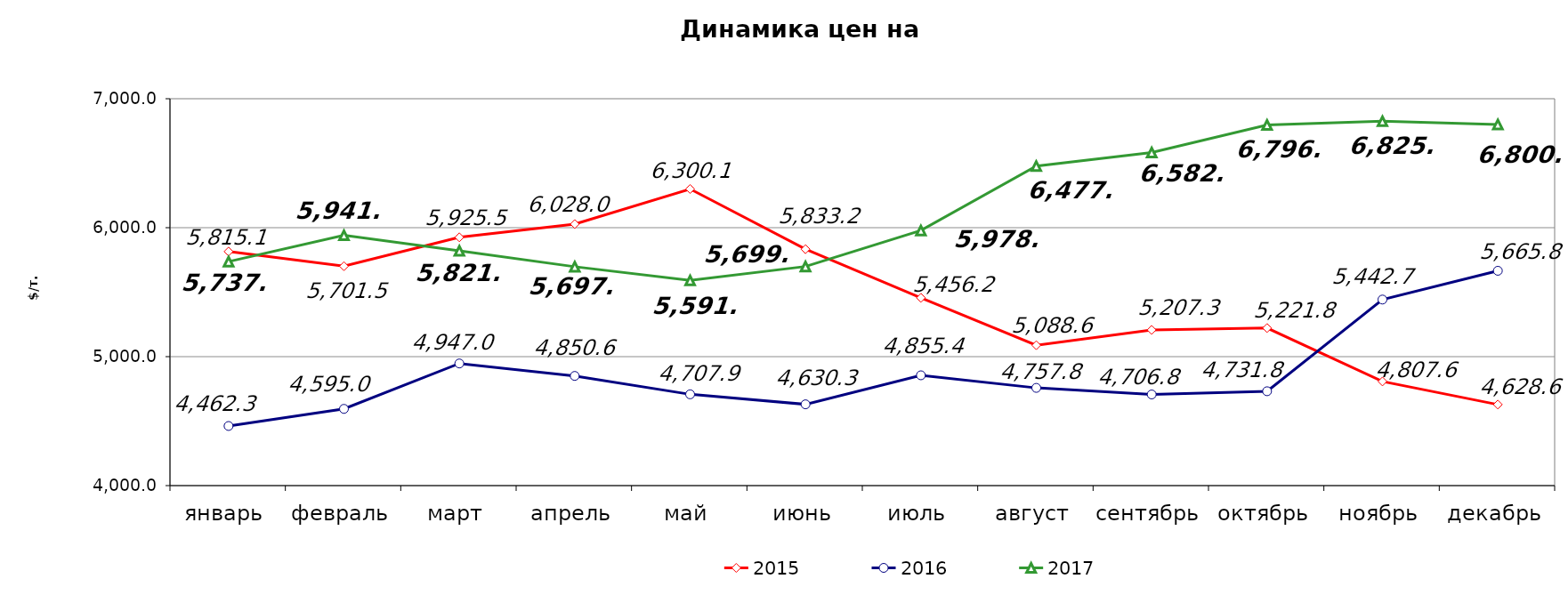
| Category | 2015 | 2016 | 2017 |
|---|---|---|---|
| январь | 5815.07 | 4462.3 | 5736.99 |
| февраль | 5701.487 | 4594.96 | 5941.1 |
| март | 5925.455 | 4947.04 | 5821.09 |
| апрель | 6027.97 | 4850.55 | 5697.37 |
| май | 6300.078 | 4707.85 | 5591.11 |
| июнь | 5833.217 | 4630.27 | 5699.08 |
| июль | 5456.217 | 4855.358 | 5978.11 |
| август | 5088.56 | 4757.817 | 6477.68 |
| сентябрь | 5207.32 | 4706.786 | 6582.68 |
| октябрь | 5221.81 | 4731.761 | 6796.85 |
| ноябрь | 4807.629 | 5442.725 | 6825.09 |
| декабрь | 4628.595 | 5665.825 | 6800.64 |